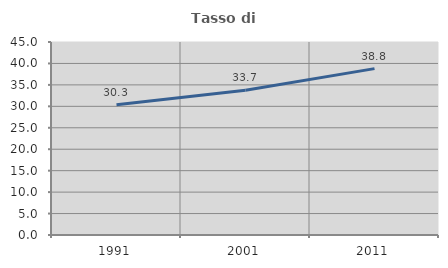
| Category | Tasso di occupazione   |
|---|---|
| 1991.0 | 30.348 |
| 2001.0 | 33.732 |
| 2011.0 | 38.793 |